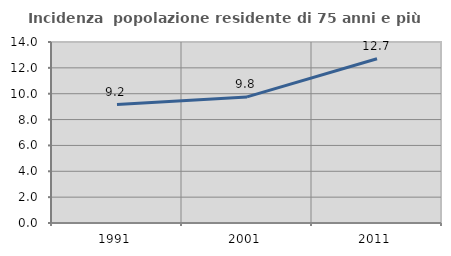
| Category | Incidenza  popolazione residente di 75 anni e più |
|---|---|
| 1991.0 | 9.164 |
| 2001.0 | 9.754 |
| 2011.0 | 12.705 |